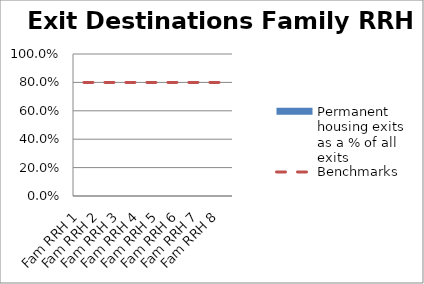
| Category | Permanent housing exits as a % of all exits |
|---|---|
| Fam RRH 1 | 0 |
| Fam RRH 2 | 0 |
| Fam RRH 3 | 0 |
| Fam RRH 4 | 0 |
| Fam RRH 5 | 0 |
| Fam RRH 6 | 0 |
| Fam RRH 7 | 0 |
| Fam RRH 8 | 0 |